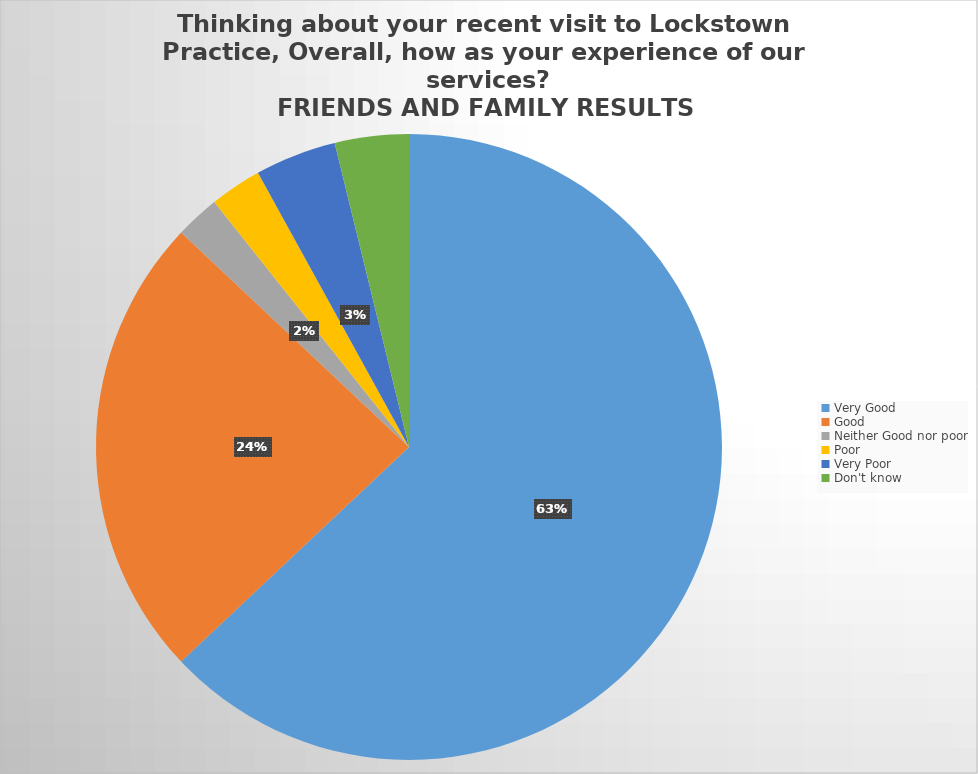
| Category | Responses |
|---|---|
| Very Good | 165 |
| Good | 63 |
| Neither Good nor poor | 6 |
| Poor | 7 |
| Very Poor | 11 |
| Don't know  | 10 |